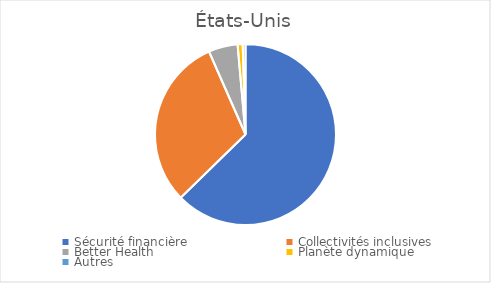
| Category | Series 0 |
|---|---|
| Sécurité financière | 62.7 |
| Collectivités inclusives | 30.7 |
| Better Health | 5.2 |
| Planète dynamique | 0.9 |
| Autres | 0.5 |